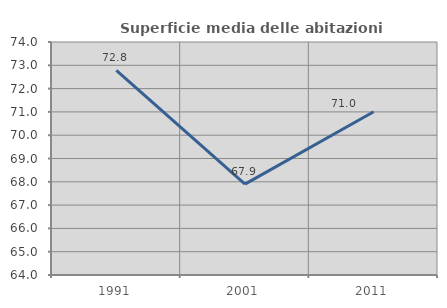
| Category | Superficie media delle abitazioni occupate |
|---|---|
| 1991.0 | 72.783 |
| 2001.0 | 67.901 |
| 2011.0 | 71.006 |